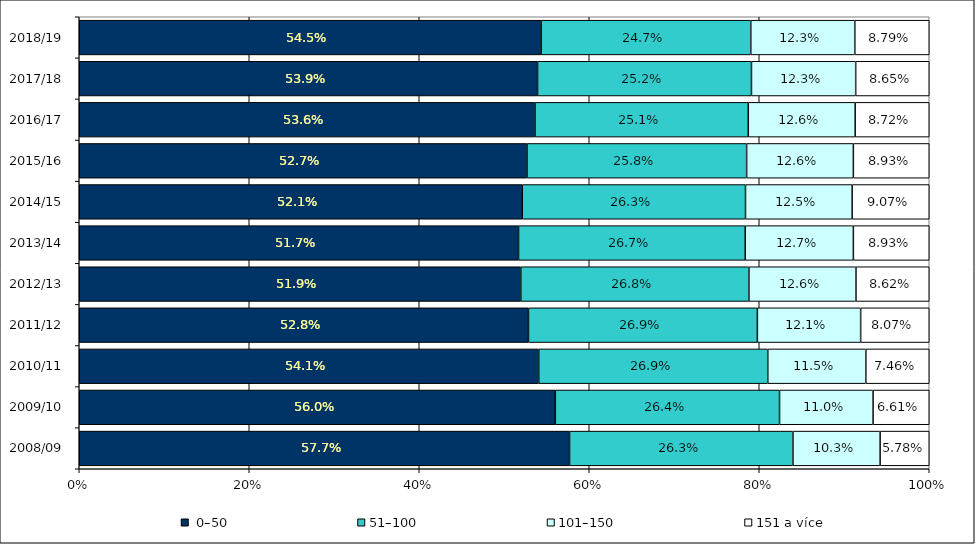
| Category |  0–50 | 51–100 | 101–150 | 151 a více |
|---|---|---|---|---|
| 2008/09 | 0.577 | 0.263 | 0.103 | 0.058 |
| 2009/10 | 0.56 | 0.264 | 0.11 | 0.066 |
| 2010/11 | 0.541 | 0.269 | 0.115 | 0.075 |
| 2011/12 | 0.528 | 0.269 | 0.121 | 0.081 |
| 2012/13 | 0.519 | 0.268 | 0.126 | 0.086 |
| 2013/14 | 0.517 | 0.267 | 0.127 | 0.089 |
| 2014/15 | 0.521 | 0.263 | 0.125 | 0.091 |
| 2015/16 | 0.527 | 0.258 | 0.126 | 0.089 |
| 2016/17 | 0.536 | 0.251 | 0.126 | 0.087 |
| 2017/18 | 0.539 | 0.252 | 0.123 | 0.087 |
| 2018/19 | 0.545 | 0.247 | 0.123 | 0.088 |